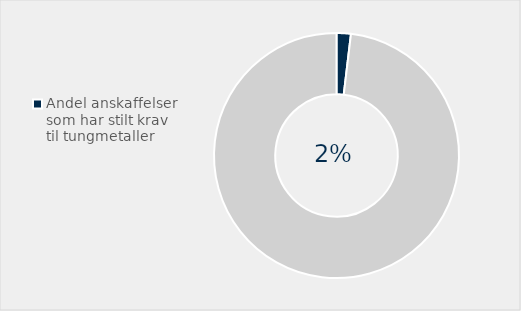
| Category | Series 0 |
|---|---|
| Andel anskaffelser som har stilt krav til tungmetaller | 0.019 |
| Ikke stilt krav  | 0.981 |